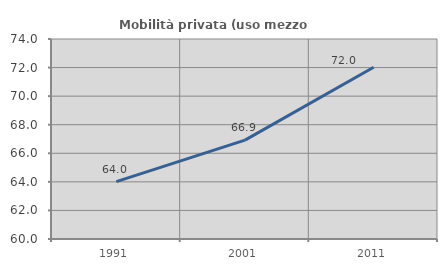
| Category | Mobilità privata (uso mezzo privato) |
|---|---|
| 1991.0 | 64.016 |
| 2001.0 | 66.921 |
| 2011.0 | 72.025 |